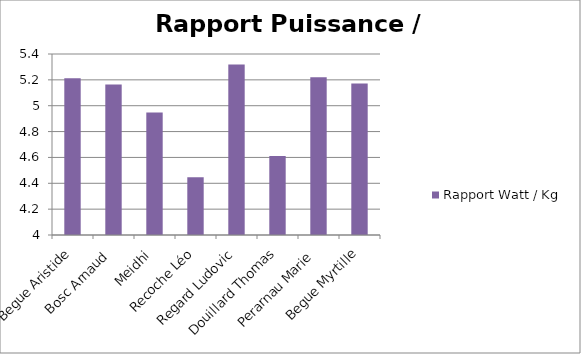
| Category | Rapport Watt / Kg |
|---|---|
| Begue Aristide | 5.213 |
| Bosc Arnaud | 5.163 |
| Meidhi | 4.947 |
| Recoche Léo | 4.447 |
| Regard Ludovic | 5.318 |
| Douillard Thomas | 4.61 |
| Perarnau Marie | 5.219 |
| Begue Myrtille | 5.172 |